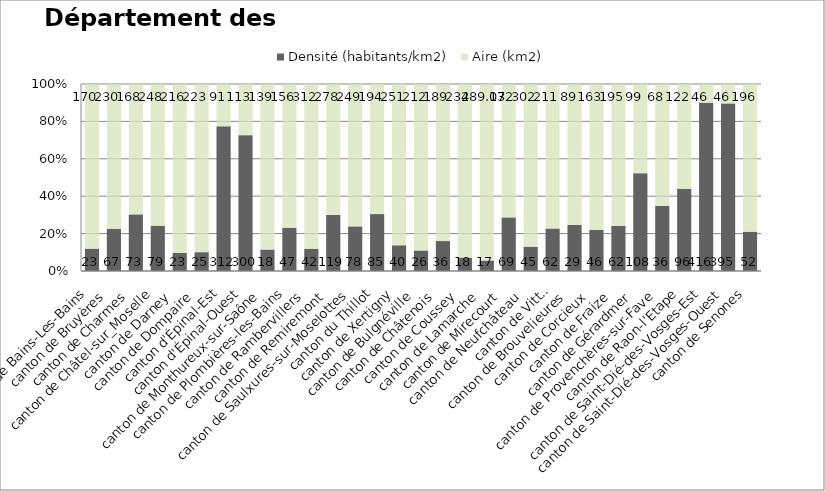
| Category | Densité (habitants/km2) | Aire (km2) |
|---|---|---|
|  canton de Bains-Les-Bains | 23 | 169.97 |
|  canton de Bruyères  | 67 | 229.51 |
|  canton de Charmes  | 73 | 168.16 |
|  canton de Châtel-sur_Moselle | 79 | 247.94 |
|  canton de Darney  | 23 | 215.52 |
|  canton de Dompaire  | 25 | 223 |
|  canton d'Épinal-Est | 312 | 91.4 |
|  canton d'Épinal-Ouest | 300 | 113 |
|  canton de Monthureux-sur-Saône | 18 | 139.21 |
|  canton de Plombières-les-Bains | 47 | 156.31 |
|  canton de Rambervillers  | 42 | 312 |
|  canton de Remiremont  | 119 | 278.19 |
|  canton de Saulxures-sur-Moselottes | 78 | 249 |
|  canton du Thillot  | 85 | 194.45 |
|  canton de Xertigny | 40 | 250.81 |
|  canton de Bulgnéville  | 26 | 211.56 |
|  canton de Châtenois  | 36 | 189.17 |
|  canton de Coussey  | 18 | 233.76 |
|  canton de Lamarche  | 17 | 289.03 |
|  canton de Mirecourt  | 69 | 171.77 |
|  canton de Neufchâteau  | 45 | 302.49 |
|  canton de Vittel | 62 | 210.94 |
|  canton de Brouvelieures  | 29 | 88.85 |
|  canton de Corcieux  | 46 | 163.42 |
|  canton de Fraize  | 62 | 195.26 |
|  canton de Gérardmer  | 108 | 98.76 |
|  canton de Provenchères-sur-Fave | 36 | 67.7 |
|  canton de Raon-l'Etape | 96 | 122 |
|  canton de Saint-Dié-des-Vosges-Est | 415.671 | 46.2 |
|  canton de Saint-Dié-des-Vosges-Ouest | 394.826 | 46 |
|  canton de Senones | 52 | 195.84 |